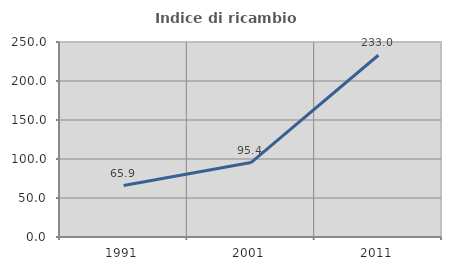
| Category | Indice di ricambio occupazionale  |
|---|---|
| 1991.0 | 65.939 |
| 2001.0 | 95.425 |
| 2011.0 | 233.019 |